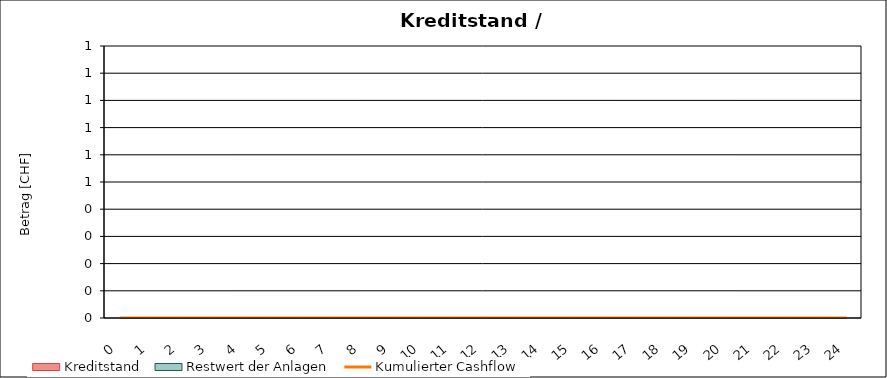
| Category | Kumulierter Cashflow |
|---|---|
| 0.0 | 0 |
| 1.0 | 0 |
| 2.0 | 0 |
| 3.0 | 0 |
| 4.0 | 0 |
| 5.0 | 0 |
| 6.0 | 0 |
| 7.0 | 0 |
| 8.0 | 0 |
| 9.0 | 0 |
| 10.0 | 0 |
| 11.0 | 0 |
| 12.0 | 0 |
| 13.0 | 0 |
| 14.0 | 0 |
| 15.0 | 0 |
| 16.0 | 0 |
| 17.0 | 0 |
| 18.0 | 0 |
| 19.0 | 0 |
| 20.0 | 0 |
| 21.0 | 0 |
| 22.0 | 0 |
| 23.0 | 0 |
| 24.0 | 0 |